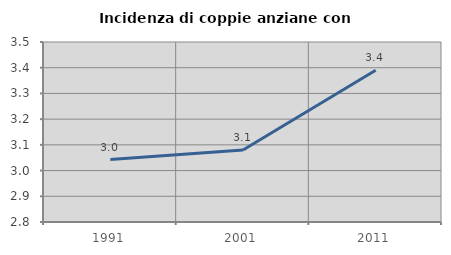
| Category | Incidenza di coppie anziane con figli |
|---|---|
| 1991.0 | 3.043 |
| 2001.0 | 3.08 |
| 2011.0 | 3.39 |